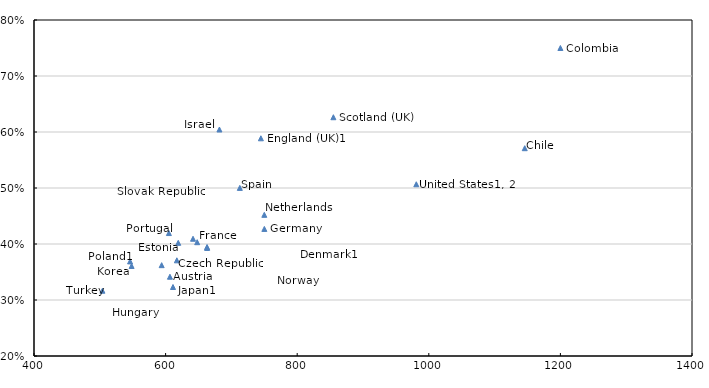
| Category | Series 8 |
|---|---|
| 855.0 | 0.626 |
| 744.8 | 0.589 |
| 1145.81343710099 | 0.571 |
| 981.0 | 0.507 |
| 1200.0 | 0.75 |
| 712.8 | 0.5 |
| 605.0 | 0.42 |
| 750.0 | 0.452 |
| 750.08736073806 | 0.427 |
| 641.7 | 0.409 |
| 648.0 | 0.403 |
| 619.2 | 0.402 |
| 663.0 | 0.395 |
| 663.1 | 0.393 |
| 617.1 | 0.371 |
| 548.34 | 0.361 |
| 606.6 | 0.342 |
| 546.0 | 0.369 |
| 611.245267 | 0.323 |
| 594.0 | 0.362 |
| 504.0 | 0.317 |
| 681.807374102787 | 0.604 |